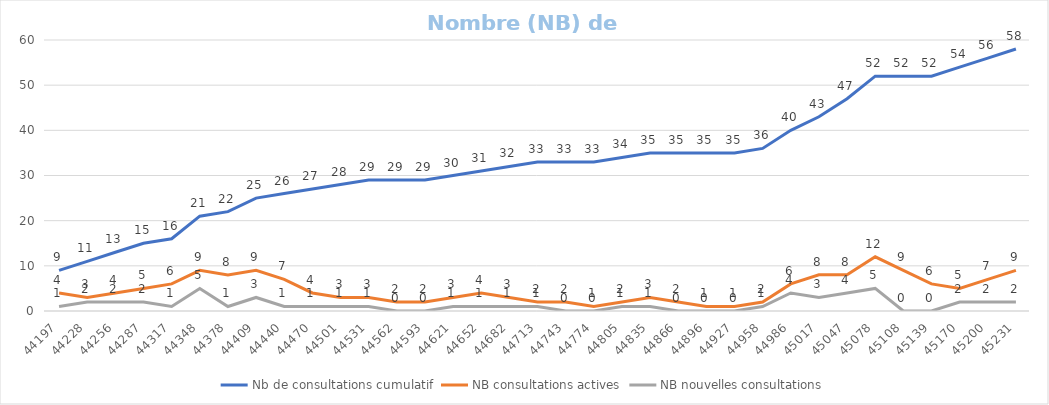
| Category | Nb de consultations cumulatif | NB consultations actives | NB nouvelles consultations |
|---|---|---|---|
| 2021-01-01 | 9 | 4 | 1 |
| 2021-02-01 | 11 | 3 | 2 |
| 2021-03-01 | 13 | 4 | 2 |
| 2021-04-01 | 15 | 5 | 2 |
| 2021-05-01 | 16 | 6 | 1 |
| 2021-06-01 | 21 | 9 | 5 |
| 2021-07-01 | 22 | 8 | 1 |
| 2021-08-01 | 25 | 9 | 3 |
| 2021-09-01 | 26 | 7 | 1 |
| 2021-10-01 | 27 | 4 | 1 |
| 2021-11-01 | 28 | 3 | 1 |
| 2021-12-01 | 29 | 3 | 1 |
| 2022-01-01 | 29 | 2 | 0 |
| 2022-02-01 | 29 | 2 | 0 |
| 2022-03-01 | 30 | 3 | 1 |
| 2022-04-01 | 31 | 4 | 1 |
| 2022-05-01 | 32 | 3 | 1 |
| 2022-06-01 | 33 | 2.002 | 1 |
| 2022-07-01 | 33 | 2 | 0 |
| 2022-08-01 | 33 | 1 | 0 |
| 2022-09-01 | 34 | 2 | 1 |
| 2022-10-01 | 35 | 3 | 1 |
| 2022-11-01 | 35 | 2 | 0 |
| 2022-12-01 | 35 | 1 | 0 |
| 2023-01-01 | 35 | 1 | 0 |
| 2023-02-01 | 36 | 2 | 1 |
| 2023-03-01 | 40 | 6 | 4 |
| 2023-04-01 | 43 | 8 | 3 |
| 2023-05-01 | 47 | 8 | 4 |
| 2023-06-01 | 52 | 12 | 5 |
| 2023-07-01 | 52 | 9 | 0 |
| 2023-08-01 | 52 | 6 | 0 |
| 2023-09-01 | 54 | 5 | 2 |
| 2023-10-01 | 56 | 7 | 2 |
| 2023-11-01 | 58 | 9 | 2 |